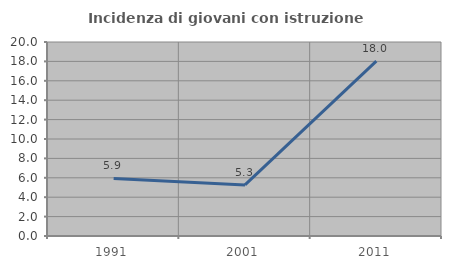
| Category | Incidenza di giovani con istruzione universitaria |
|---|---|
| 1991.0 | 5.936 |
| 2001.0 | 5.263 |
| 2011.0 | 18.033 |